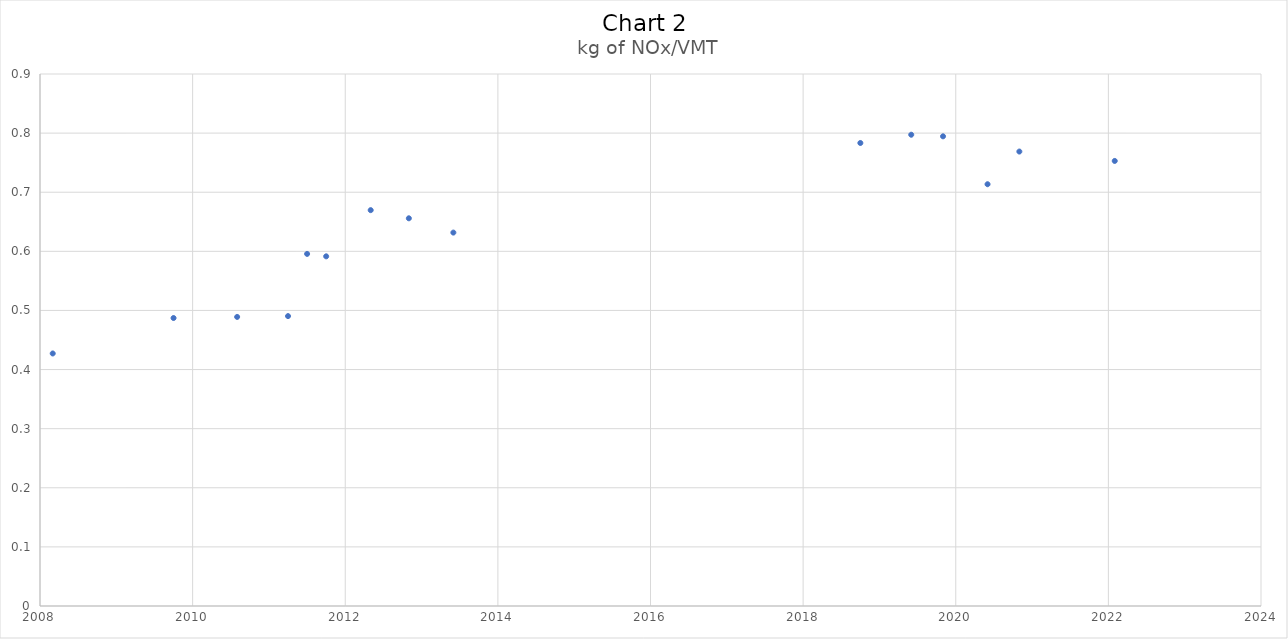
| Category | kg of NOx/VMT |
|---|---|
| 2008.1666666666667 | 0.427 |
| 2009.75 | 0.487 |
| 2010.5833333333333 | 0.489 |
| 2011.25 | 0.49 |
| 2011.5 | 0.596 |
| 2011.75 | 0.592 |
| 2012.3333333333333 | 0.67 |
| 2012.8333333333333 | 0.656 |
| 2013.4166666666667 | 0.632 |
| 2018.75 | 0.783 |
| 2019.4166666666667 | 0.797 |
| 2019.8333333333333 | 0.795 |
| 2020.4166666666667 | 0.714 |
| 2020.8333333333333 | 0.769 |
| 2022.0833333333333 | 0.753 |